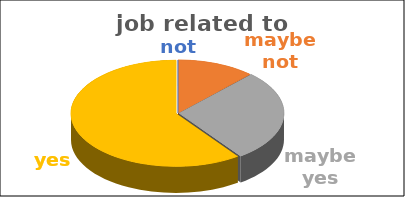
| Category | job related to studies | Series 1 | Series 2 | Series 3 | Series 4 |
|---|---|---|---|---|---|
| not | 0 |  |  |  |  |
| maybe not | 0.12 |  |  |  |  |
| maybe yes | 0.28 |  |  |  |  |
| yes | 0.6 |  |  |  |  |